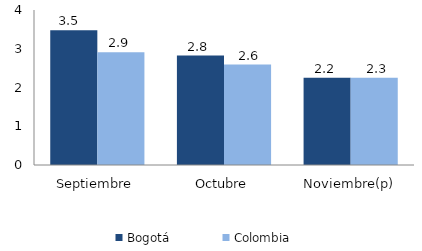
| Category | Bogotá | Colombia |
|---|---|---|
| Septiembre | 3.476 | 2.908 |
| Octubre | 2.824 | 2.591 |
| Noviembre(p) | 2.25 | 2.252 |